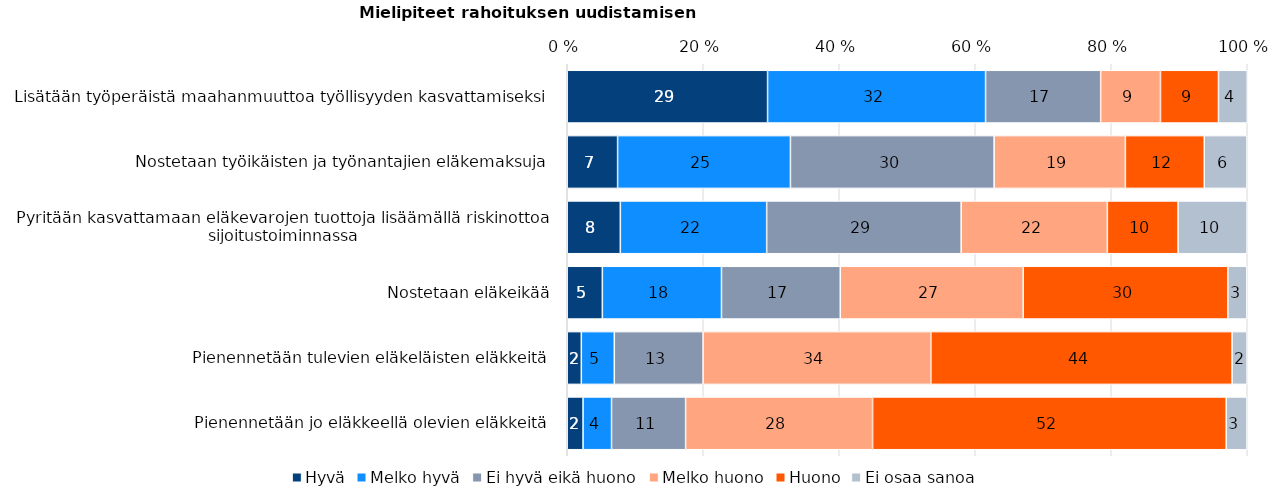
| Category | Hyvä | Melko hyvä | Ei hyvä eikä huono | Melko huono | Huono | Ei osaa sanoa |
|---|---|---|---|---|---|---|
| Lisätään työperäistä maahanmuuttoa työllisyyden kasvattamiseksi | 29.458 | 32.06 | 16.925 | 8.798 | 8.531 | 4.228 |
| Nostetaan työikäisten ja työnantajien eläkemaksuja | 7.405 | 25.417 | 29.956 | 19.3 | 11.6 | 6.286 |
| Pyritään kasvattamaan eläkevarojen tuottoja lisäämällä riskinottoa sijoitustoiminnassa | 7.806 | 21.523 | 28.601 | 21.5 | 10.4 | 10.145 |
| Nostetaan eläkeikää | 5.163 | 17.518 | 17.469 | 26.9 | 30.1 | 2.796 |
| Pienennetään tulevien eläkeläisten eläkkeitä | 2.07 | 4.849 | 13.055 | 33.5 | 44.3 | 2.201 |
| Pienennetään jo eläkkeellä olevien eläkkeitä | 2.325 | 4.187 | 10.893 | 27.5 | 52 | 3.057 |